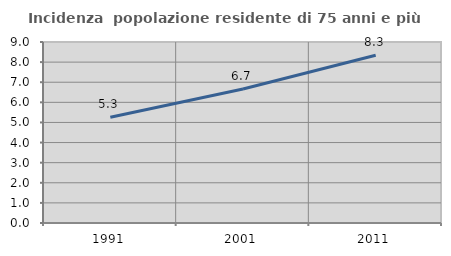
| Category | Incidenza  popolazione residente di 75 anni e più |
|---|---|
| 1991.0 | 5.255 |
| 2001.0 | 6.663 |
| 2011.0 | 8.341 |